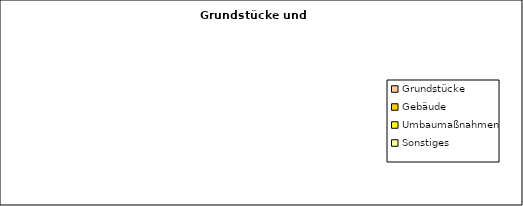
| Category | Series 0 |
|---|---|
| Grundstücke | 0 |
| Gebäude | 0 |
| Umbaumaßnahmen | 0 |
| Sonstiges | 0 |